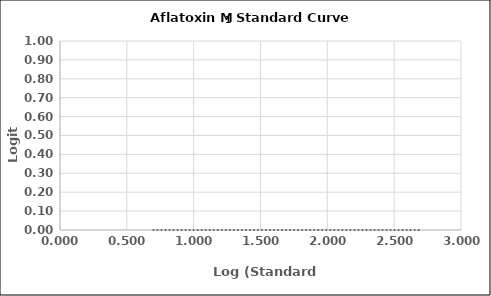
| Category | Series 0 |
|---|---|
| 0.6989700043360189 | 0 |
| 1.1760912590556813 | 0 |
| 1.6989700043360187 | 0 |
| 2.1760912590556813 | 0 |
| 2.6989700043360187 | 0 |